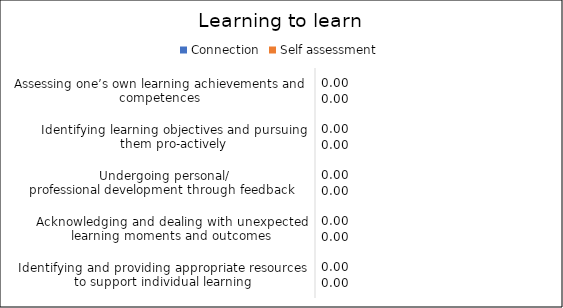
| Category | Connection | Self assessment |
|---|---|---|
| Assessing one’s own learning achievements and competences | 0 | 0 |
| Identifying learning objectives and pursuing them pro-actively | 0 | 0 |
| Undergoing personal/
professional development through feedback 
 | 0 | 0 |
| Acknowledging and dealing with unexpected learning moments and outcomes | 0 | 0 |
| Identifying and providing appropriate resources to support individual learning | 0 | 0 |